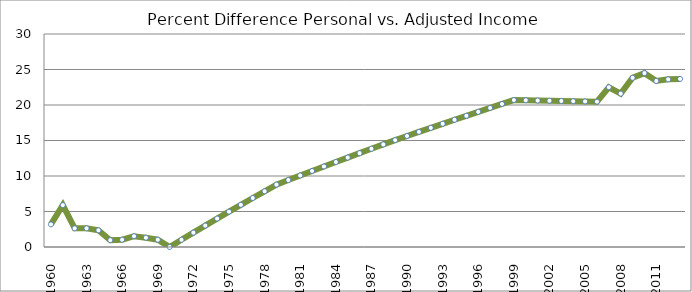
| Category | Series 0 |
|---|---|
| 1960.0 | 3.182 |
| 1961.0 | 5.89 |
| 1962.0 | 2.631 |
| 1963.0 | 2.631 |
| 1964.0 | 2.354 |
| 1965.0 | 0.96 |
| 1966.0 | 1.026 |
| 1967.0 | 1.52 |
| 1968.0 | 1.313 |
| 1969.0 | 1.026 |
| 1970.0 | 0 |
| 1971.0 | 1.016 |
| 1972.0 | 2.021 |
| 1973.0 | 3.017 |
| 1974.0 | 4.002 |
| 1975.0 | 4.978 |
| 1976.0 | 5.944 |
| 1977.0 | 6.9 |
| 1978.0 | 7.847 |
| 1979.0 | 8.785 |
| 1980.0 | 9.431 |
| 1981.0 | 10.073 |
| 1982.0 | 10.71 |
| 1983.0 | 11.343 |
| 1984.0 | 11.972 |
| 1985.0 | 12.596 |
| 1986.0 | 13.217 |
| 1987.0 | 13.833 |
| 1988.0 | 14.445 |
| 1989.0 | 15.054 |
| 1990.0 | 15.634 |
| 1991.0 | 16.211 |
| 1992.0 | 16.784 |
| 1993.0 | 17.353 |
| 1994.0 | 17.919 |
| 1995.0 | 18.481 |
| 1996.0 | 19.04 |
| 1997.0 | 19.596 |
| 1998.0 | 20.148 |
| 1999.0 | 20.697 |
| 2000.0 | 20.664 |
| 2001.0 | 20.632 |
| 2002.0 | 20.599 |
| 2003.0 | 20.566 |
| 2004.0 | 20.534 |
| 2005.0 | 20.501 |
| 2006.0 | 20.468 |
| 2007.0 | 22.502 |
| 2008.0 | 21.604 |
| 2009.0 | 23.832 |
| 2010.0 | 24.49 |
| 2011.0 | 23.391 |
| 2012.0 | 23.612 |
| 2013.0 | 23.678 |